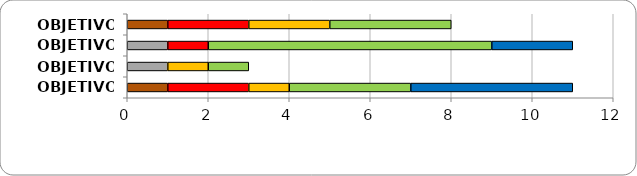
| Category | Series 0 | Series 1 | Series 2 | Series 3 | Series 4 | Series 5 |
|---|---|---|---|---|---|---|
| OBJETIVO 1 | 1 | 0 | 2 | 2 | 3 | 0 |
| OBJETIVO 2 | 0 | 1 | 1 | 0 | 7 | 2 |
| OBJETIVO 3 | 0 | 1 | 0 | 1 | 1 | 0 |
| OBJETIVO 4 | 1 | 0 | 2 | 1 | 3 | 4 |